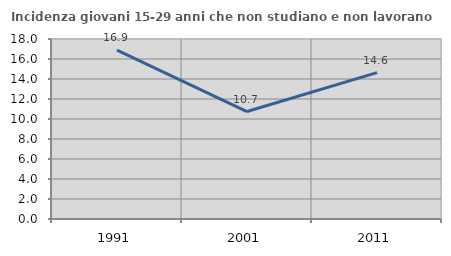
| Category | Incidenza giovani 15-29 anni che non studiano e non lavorano  |
|---|---|
| 1991.0 | 16.891 |
| 2001.0 | 10.744 |
| 2011.0 | 14.634 |